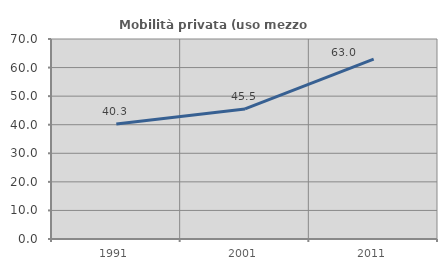
| Category | Mobilità privata (uso mezzo privato) |
|---|---|
| 1991.0 | 40.283 |
| 2001.0 | 45.516 |
| 2011.0 | 62.989 |